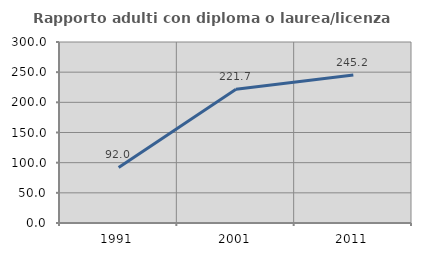
| Category | Rapporto adulti con diploma o laurea/licenza media  |
|---|---|
| 1991.0 | 92.045 |
| 2001.0 | 221.667 |
| 2011.0 | 245.161 |